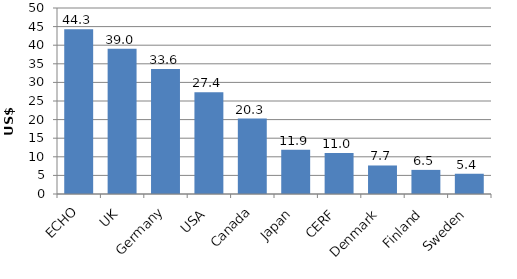
| Category | US$ millions |
|---|---|
| ECHO | 44.286 |
| UK | 39.04 |
| Germany | 33.578 |
| USA | 27.385 |
| Canada | 20.273 |
| Japan | 11.9 |
| CERF | 11.006 |
| Denmark | 7.665 |
| Finland | 6.483 |
| Sweden | 5.445 |